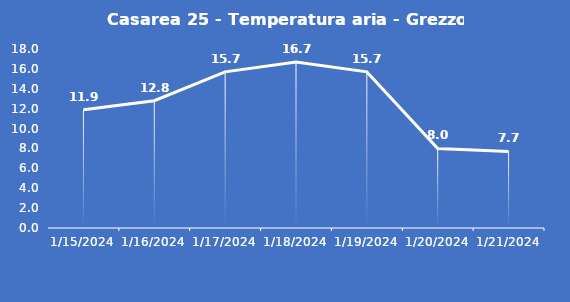
| Category | Casarea 25 - Temperatura aria - Grezzo (°C) |
|---|---|
| 1/15/24 | 11.9 |
| 1/16/24 | 12.8 |
| 1/17/24 | 15.7 |
| 1/18/24 | 16.7 |
| 1/19/24 | 15.7 |
| 1/20/24 | 8 |
| 1/21/24 | 7.7 |